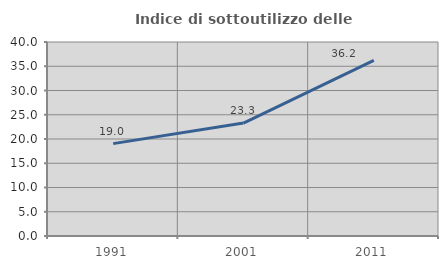
| Category | Indice di sottoutilizzo delle abitazioni  |
|---|---|
| 1991.0 | 19.045 |
| 2001.0 | 23.283 |
| 2011.0 | 36.205 |